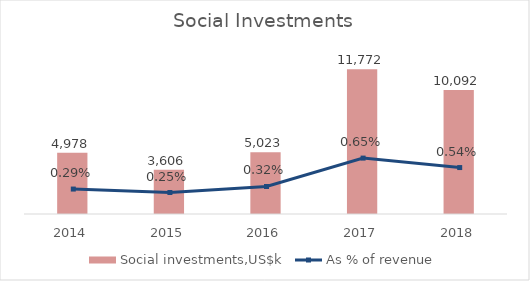
| Category | Social investments,US$k |
|---|---|
| 2014.0 | 4978 |
| 2015.0 | 3606 |
| 2016.0 | 5023 |
| 2017.0 | 11772 |
| 2018.0 | 10092 |